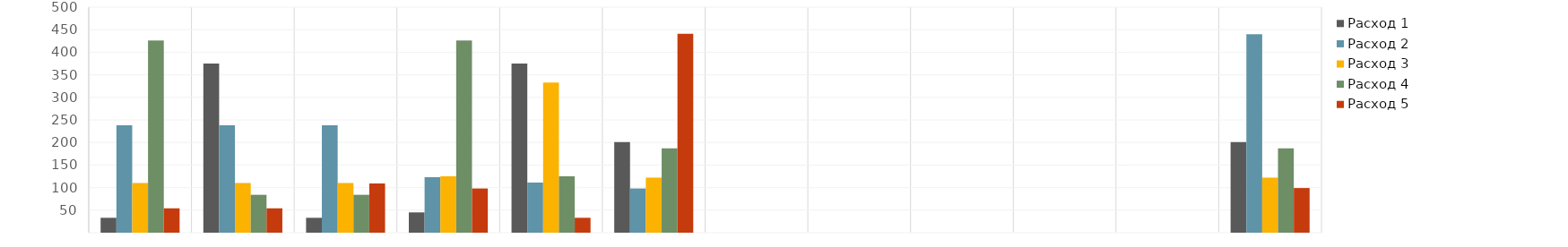
| Category | Расход 1 | Расход 2 | Расход 3 | Расход 4 | Расход 5 |
|---|---|---|---|---|---|
| Январь | 33 | 238 | 110 | 426 | 54 |
| Февраль | 375 | 238 | 110 | 84 | 54 |
| Март | 33 | 238 | 110 | 84 | 109 |
| Апрель | 45 | 123 | 125 | 426 | 98 |
| Май | 375 | 111 | 333 | 125 | 33 |
| Июнь | 201 | 98 | 122 | 187 | 441 |
| Июль | 0 | 0 | 0 | 0 | 0 |
| Август | 0 | 0 | 0 | 0 | 0 |
| Сентябрь | 0 | 0 | 0 | 0 | 0 |
| Октябрь | 0 | 0 | 0 | 0 | 0 |
| Ноябрь | 0 | 0 | 0 | 0 | 0 |
| Декабрь | 201 | 440 | 122 | 187 | 99 |